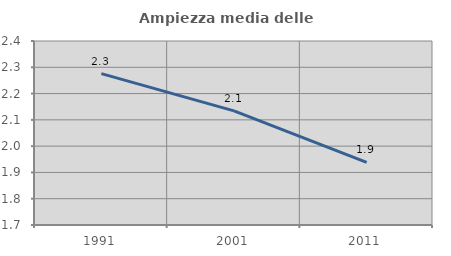
| Category | Ampiezza media delle famiglie |
|---|---|
| 1991.0 | 2.276 |
| 2001.0 | 2.134 |
| 2011.0 | 1.938 |